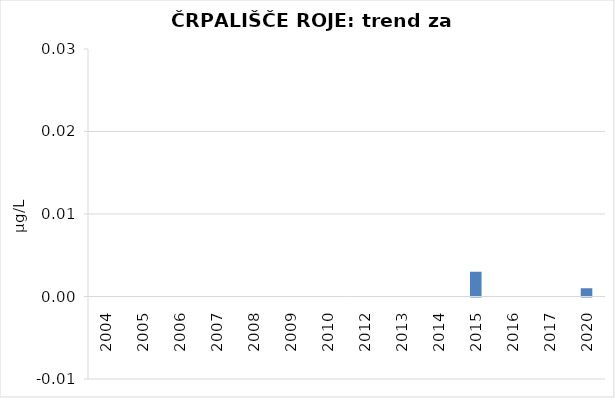
| Category | Vsota |
|---|---|
| 2004 | 0 |
| 2005 | 0 |
| 2006 | 0 |
| 2007 | 0 |
| 2008 | 0 |
| 2009 | 0 |
| 2010 | 0 |
| 2012 | 0 |
| 2013 | 0 |
| 2014 | 0 |
| 2015 | 0.003 |
| 2016 | 0 |
| 2017 | 0 |
| 2020 | 0.001 |